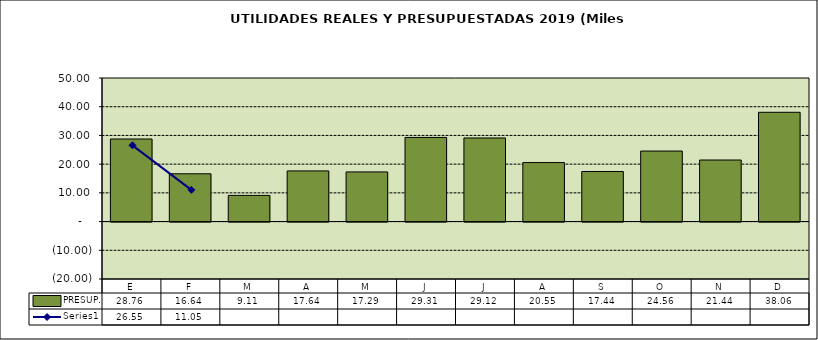
| Category | PRESUP. |
|---|---|
| E | 28.758 |
| F | 16.643 |
| M | 9.113 |
| A | 17.642 |
| M | 17.293 |
| J | 29.306 |
| J | 29.12 |
| A | 20.548 |
| S | 17.443 |
| O | 24.562 |
| N | 21.442 |
| D | 38.059 |